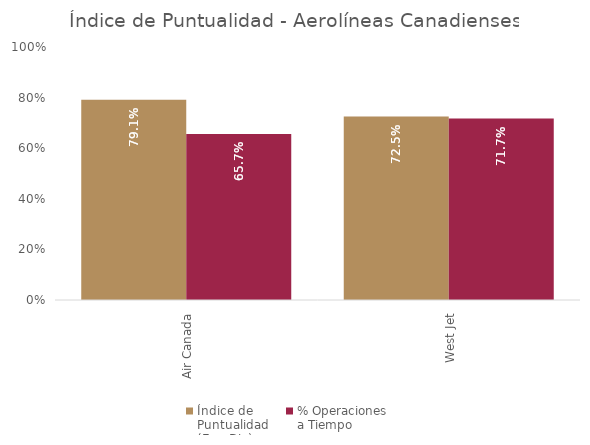
| Category | Índice de 
Puntualidad
(Ene-Dic) | % Operaciones 
a Tiempo |
|---|---|---|
| Air Canada | 0.791 | 0.657 |
| West Jet | 0.725 | 0.717 |